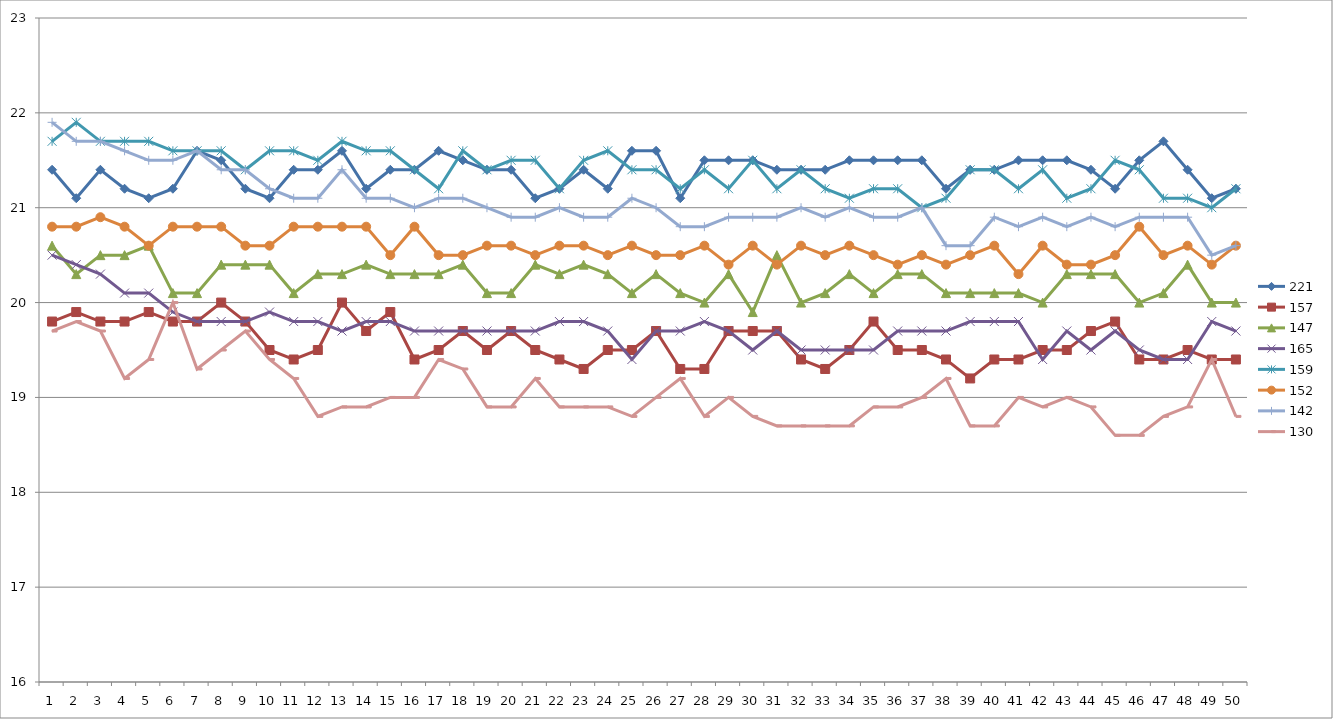
| Category | 221 | 157 | 147 | 165 | 159 | 152 | 142 | 130 |
|---|---|---|---|---|---|---|---|---|
| 0 | 21.4 | 19.8 | 20.6 | 20.5 | 21.7 | 20.8 | 21.9 | 19.7 |
| 1 | 21.1 | 19.9 | 20.3 | 20.4 | 21.9 | 20.8 | 21.7 | 19.8 |
| 2 | 21.4 | 19.8 | 20.5 | 20.3 | 21.7 | 20.9 | 21.7 | 19.7 |
| 3 | 21.2 | 19.8 | 20.5 | 20.1 | 21.7 | 20.8 | 21.6 | 19.2 |
| 4 | 21.1 | 19.9 | 20.6 | 20.1 | 21.7 | 20.6 | 21.5 | 19.4 |
| 5 | 21.2 | 19.8 | 20.1 | 19.9 | 21.6 | 20.8 | 21.5 | 20 |
| 6 | 21.6 | 19.8 | 20.1 | 19.8 | 21.6 | 20.8 | 21.6 | 19.3 |
| 7 | 21.5 | 20 | 20.4 | 19.8 | 21.6 | 20.8 | 21.4 | 19.5 |
| 8 | 21.2 | 19.8 | 20.4 | 19.8 | 21.4 | 20.6 | 21.4 | 19.7 |
| 9 | 21.1 | 19.5 | 20.4 | 19.9 | 21.6 | 20.6 | 21.2 | 19.4 |
| 10 | 21.4 | 19.4 | 20.1 | 19.8 | 21.6 | 20.8 | 21.1 | 19.2 |
| 11 | 21.4 | 19.5 | 20.3 | 19.8 | 21.5 | 20.8 | 21.1 | 18.8 |
| 12 | 21.6 | 20 | 20.3 | 19.7 | 21.7 | 20.8 | 21.4 | 18.9 |
| 13 | 21.2 | 19.7 | 20.4 | 19.8 | 21.6 | 20.8 | 21.1 | 18.9 |
| 14 | 21.4 | 19.9 | 20.3 | 19.8 | 21.6 | 20.5 | 21.1 | 19 |
| 15 | 21.4 | 19.4 | 20.3 | 19.7 | 21.4 | 20.8 | 21 | 19 |
| 16 | 21.6 | 19.5 | 20.3 | 19.7 | 21.2 | 20.5 | 21.1 | 19.4 |
| 17 | 21.5 | 19.7 | 20.4 | 19.7 | 21.6 | 20.5 | 21.1 | 19.3 |
| 18 | 21.4 | 19.5 | 20.1 | 19.7 | 21.4 | 20.6 | 21 | 18.9 |
| 19 | 21.4 | 19.7 | 20.1 | 19.7 | 21.5 | 20.6 | 20.9 | 18.9 |
| 20 | 21.1 | 19.5 | 20.4 | 19.7 | 21.5 | 20.5 | 20.9 | 19.2 |
| 21 | 21.2 | 19.4 | 20.3 | 19.8 | 21.2 | 20.6 | 21 | 18.9 |
| 22 | 21.4 | 19.3 | 20.4 | 19.8 | 21.5 | 20.6 | 20.9 | 18.9 |
| 23 | 21.2 | 19.5 | 20.3 | 19.7 | 21.6 | 20.5 | 20.9 | 18.9 |
| 24 | 21.6 | 19.5 | 20.1 | 19.4 | 21.4 | 20.6 | 21.1 | 18.8 |
| 25 | 21.6 | 19.7 | 20.3 | 19.7 | 21.4 | 20.5 | 21 | 19 |
| 26 | 21.1 | 19.3 | 20.1 | 19.7 | 21.2 | 20.5 | 20.8 | 19.2 |
| 27 | 21.5 | 19.3 | 20 | 19.8 | 21.4 | 20.6 | 20.8 | 18.8 |
| 28 | 21.5 | 19.7 | 20.3 | 19.7 | 21.2 | 20.4 | 20.9 | 19 |
| 29 | 21.5 | 19.7 | 19.9 | 19.5 | 21.5 | 20.6 | 20.9 | 18.8 |
| 30 | 21.4 | 19.7 | 20.5 | 19.7 | 21.2 | 20.4 | 20.9 | 18.7 |
| 31 | 21.4 | 19.4 | 20 | 19.5 | 21.4 | 20.6 | 21 | 18.7 |
| 32 | 21.4 | 19.3 | 20.1 | 19.5 | 21.2 | 20.5 | 20.9 | 18.7 |
| 33 | 21.5 | 19.5 | 20.3 | 19.5 | 21.1 | 20.6 | 21 | 18.7 |
| 34 | 21.5 | 19.8 | 20.1 | 19.5 | 21.2 | 20.5 | 20.9 | 18.9 |
| 35 | 21.5 | 19.5 | 20.3 | 19.7 | 21.2 | 20.4 | 20.9 | 18.9 |
| 36 | 21.5 | 19.5 | 20.3 | 19.7 | 21 | 20.5 | 21 | 19 |
| 37 | 21.2 | 19.4 | 20.1 | 19.7 | 21.1 | 20.4 | 20.6 | 19.2 |
| 38 | 21.4 | 19.2 | 20.1 | 19.8 | 21.4 | 20.5 | 20.6 | 18.7 |
| 39 | 21.4 | 19.4 | 20.1 | 19.8 | 21.4 | 20.6 | 20.9 | 18.7 |
| 40 | 21.5 | 19.4 | 20.1 | 19.8 | 21.2 | 20.3 | 20.8 | 19 |
| 41 | 21.5 | 19.5 | 20 | 19.4 | 21.4 | 20.6 | 20.9 | 18.9 |
| 42 | 21.5 | 19.5 | 20.3 | 19.7 | 21.1 | 20.4 | 20.8 | 19 |
| 43 | 21.4 | 19.7 | 20.3 | 19.5 | 21.2 | 20.4 | 20.9 | 18.9 |
| 44 | 21.2 | 19.8 | 20.3 | 19.7 | 21.5 | 20.5 | 20.8 | 18.6 |
| 45 | 21.5 | 19.4 | 20 | 19.5 | 21.4 | 20.8 | 20.9 | 18.6 |
| 46 | 21.7 | 19.4 | 20.1 | 19.4 | 21.1 | 20.5 | 20.9 | 18.8 |
| 47 | 21.4 | 19.5 | 20.4 | 19.4 | 21.1 | 20.6 | 20.9 | 18.9 |
| 48 | 21.1 | 19.4 | 20 | 19.8 | 21 | 20.4 | 20.5 | 19.4 |
| 49 | 21.2 | 19.4 | 20 | 19.7 | 21.2 | 20.6 | 20.6 | 18.8 |